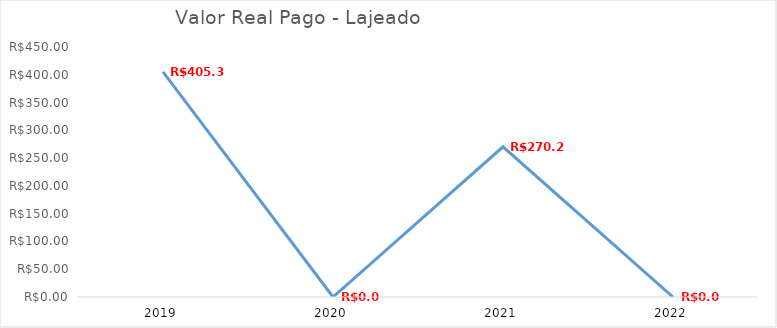
| Category | Series 0 |
|---|---|
| 2019.0 | 405.39 |
| 2020.0 | 0 |
| 2021.0 | 270.26 |
| 2022.0 | 0 |